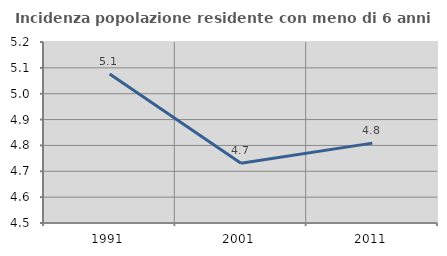
| Category | Incidenza popolazione residente con meno di 6 anni |
|---|---|
| 1991.0 | 5.076 |
| 2001.0 | 4.731 |
| 2011.0 | 4.809 |